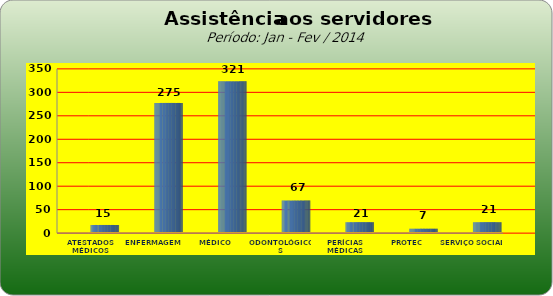
| Category | Series 0 |
|---|---|
| ATESTADOS MÉDICOS | 15 |
| ENFERMAGEM | 275 |
| MÉDICO | 321 |
| ODONTOLÓGICOS | 67 |
| PERÍCIAS MÉDICAS | 21 |
| PROTEC | 7 |
| SERVIÇO SOCIAL | 21 |